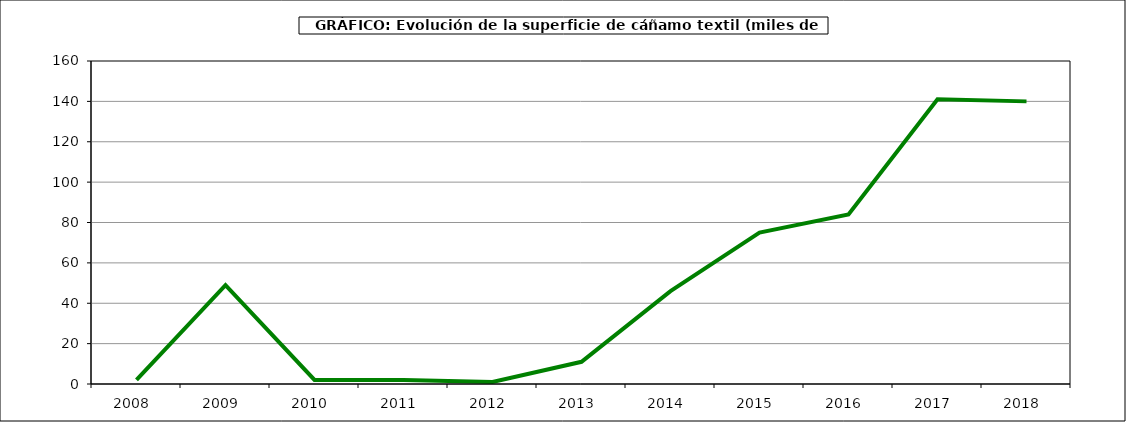
| Category | Superficie |
|---|---|
| 2008.0 | 2 |
| 2009.0 | 49 |
| 2010.0 | 2 |
| 2011.0 | 2 |
| 2012.0 | 1 |
| 2013.0 | 11 |
| 2014.0 | 46 |
| 2015.0 | 75 |
| 2016.0 | 84 |
| 2017.0 | 141 |
| 2018.0 | 140 |